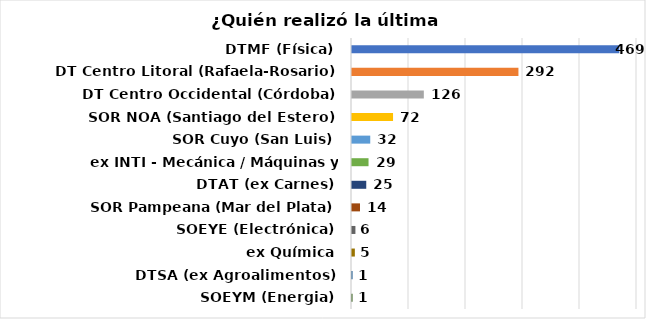
| Category | Series 0 |
|---|---|
| DTMF (Física) | 469 |
| DT Centro Litoral (Rafaela-Rosario) | 292 |
| DT Centro Occidental (Córdoba) | 126 |
| SOR NOA (Santiago del Estero) | 72 |
| SOR Cuyo (San Luis) | 32 |
| ex INTI - Mecánica / Máquinas y Herramientas | 29 |
| DTAT (ex Carnes) | 25 |
| SOR Pampeana (Mar del Plata) | 14 |
| SOEYE (Electrónica) | 6 |
| ex Química | 5 |
| DTSA (ex Agroalimentos) | 1 |
| SOEYM (Energia) | 1 |